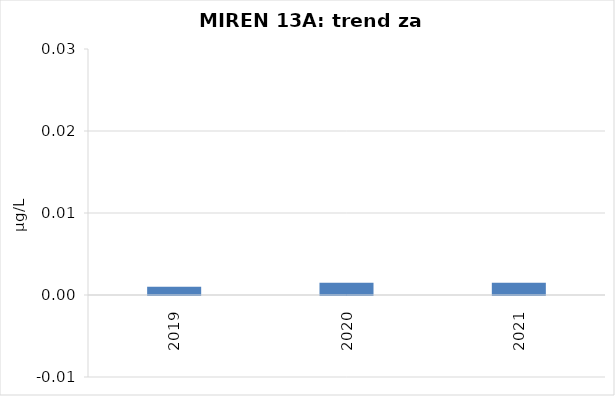
| Category | Vsota |
|---|---|
| 2019 | 0.001 |
| 2020 | 0.002 |
| 2021 | 0.002 |